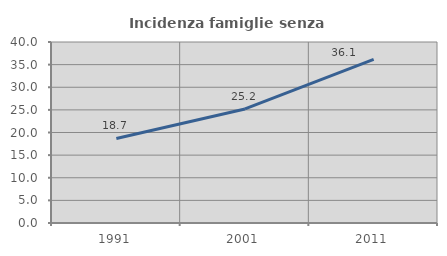
| Category | Incidenza famiglie senza nuclei |
|---|---|
| 1991.0 | 18.689 |
| 2001.0 | 25.203 |
| 2011.0 | 36.138 |